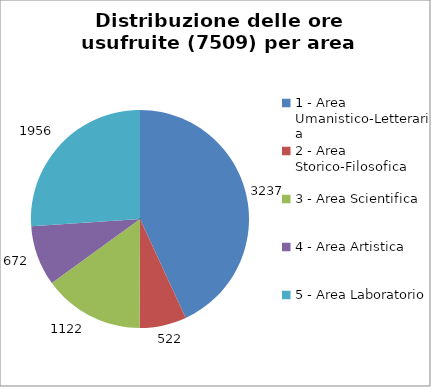
| Category | Nr. Ore Usufruite |
|---|---|
| 1 - Area Umanistico-Letteraria | 3237 |
| 2 - Area Storico-Filosofica | 522 |
| 3 - Area Scientifica | 1122 |
| 4 - Area Artistica | 672 |
| 5 - Area Laboratorio | 1956 |